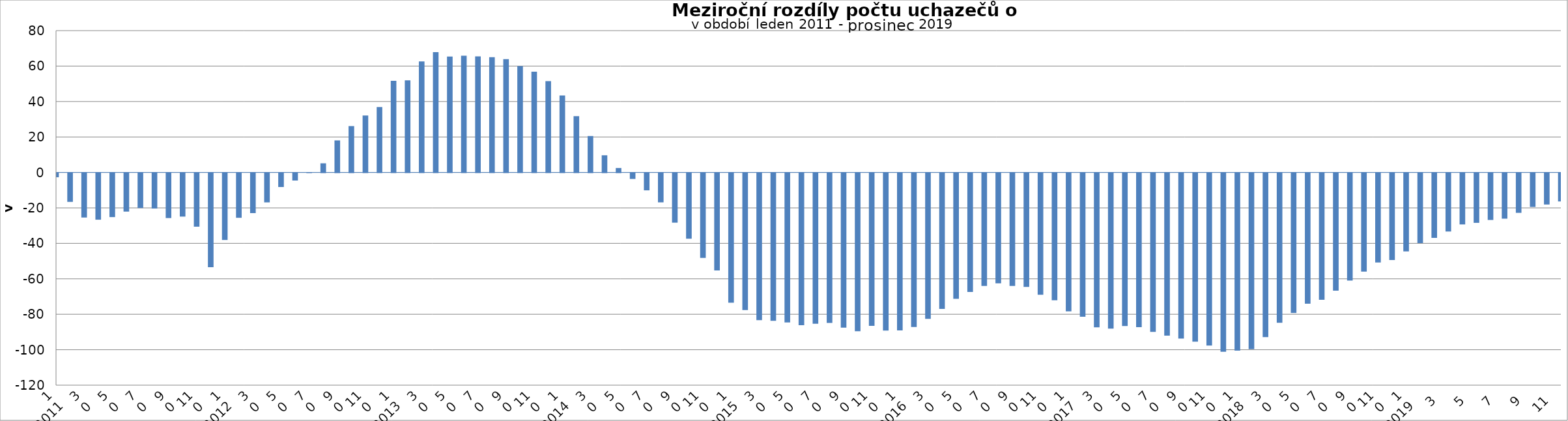
| Category | Series 1 |
|---|---|
| 0 | -2363 |
| 1 | -16239 |
| 2 | -25062 |
| 3 | -26286 |
| 4 | -24823 |
| 5 | -21725 |
| 6 | -19700 |
| 7 | -19959 |
| 8 | -25366 |
| 9 | -24543 |
| 10 | -30236 |
| 11 | -53100 |
| 12 | -37774 |
| 13 | -25211 |
| 14 | -22582 |
| 15 | -16520 |
| 16 | -7857 |
| 17 | -4189 |
| 18 | 13 |
| 19 | 5158 |
| 20 | 18070 |
| 21 | 26144 |
| 22 | 32094 |
| 23 | 36860 |
| 24 | 51720 |
| 25 | 51998 |
| 26 | 62588 |
| 27 | 67906 |
| 28 | 65364 |
| 29 | 65887 |
| 30 | 65499 |
| 31 | 65038 |
| 32 | 63873 |
| 33 | 59919 |
| 34 | 56815 |
| 35 | 51522 |
| 36 | 43465 |
| 37 | 31707 |
| 38 | 20547 |
| 39 | 9680 |
| 40 | 2510 |
| 41 | -3294 |
| 42 | -9732 |
| 43 | -16506 |
| 44 | -27960 |
| 45 | -37043 |
| 46 | -47805 |
| 47 | -54919 |
| 48 | -73083 |
| 49 | -77273 |
| 50 | -83000 |
| 51 | -83323 |
| 52 | -84284 |
| 53 | -85784 |
| 54 | -85023 |
| 55 | -84559 |
| 56 | -87206 |
| 57 | -89206 |
| 58 | -86144 |
| 59 | -88796 |
| 60 | -88788 |
| 61 | -86863 |
| 62 | -82206 |
| 63 | -76625 |
| 64 | -70900 |
| 65 | -67067 |
| 66 | -63674 |
| 67 | -62192 |
| 68 | -63634 |
| 69 | -64188 |
| 70 | -68609 |
| 71 | -71745 |
| 72 | -77987 |
| 73 | -81046 |
| 74 | -86997 |
| 75 | -87761 |
| 76 | -86268 |
| 77 | -86889 |
| 78 | -89593 |
| 79 | -91648 |
| 80 | -93343 |
| 81 | -95071 |
| 82 | -97286 |
| 83 | -100753 |
| 84 | -100188 |
| 85 | -99309 |
| 86 | -92504 |
| 87 | -84401 |
| 88 | -78889 |
| 89 | -73653 |
| 90 | -71509 |
| 91 | -66327 |
| 92 | -60584 |
| 93 | -55551 |
| 94 | -50459 |
| 95 | -49086 |
| 96 | -44171 |
| 97 | -39482 |
| 98 | -36555 |
| 99 | -32970 |
| 100 | -28957 |
| 101 | -28063 |
| 102 | -26445 |
| 103 | -25710 |
| 104 | -22424 |
| 105 | -19104 |
| 106 | -17721 |
| 107 | -16002 |